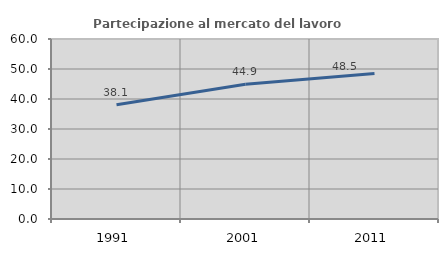
| Category | Partecipazione al mercato del lavoro  femminile |
|---|---|
| 1991.0 | 38.059 |
| 2001.0 | 44.948 |
| 2011.0 | 48.527 |